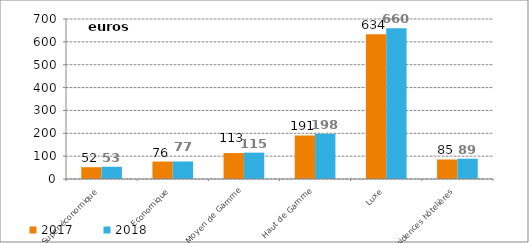
| Category | 2017 | 2018 |
|---|---|---|
| Super-économique | 51.626 | 53.466 |
| Economique | 76.335 | 76.734 |
| Moyen de Gamme | 113.488 | 115.293 |
| Haut de Gamme | 190.76 | 198.366 |
| Luxe | 633.658 | 659.656 |
| Résidences hôtelières | 85.422 | 88.857 |